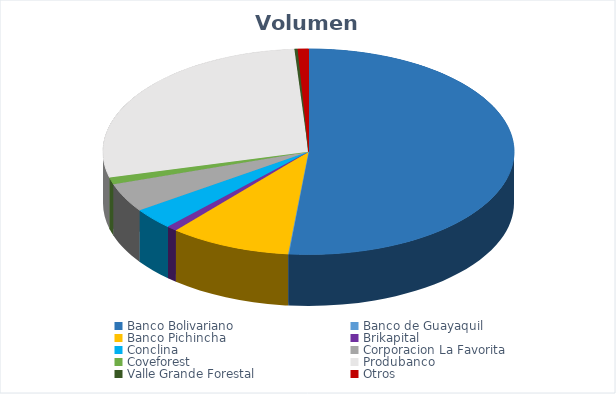
| Category | VOLUMEN ($USD) |
|---|---|
| Banco Bolivariano | 249670.8 |
| Banco de Guayaquil | 325.95 |
| Banco Pichincha | 46438 |
| Brikapital | 4000 |
| Conclina | 16212 |
| Corporacion La Favorita | 22051.71 |
| Coveforest | 5200 |
| Produbanco | 135530 |
| Valle Grande Forestal | 1201.2 |
| Otros | 4084.2 |